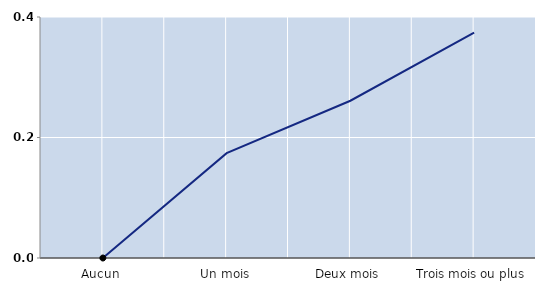
| Category | Nombre de mois passés au chômage l'année précédente |
|---|---|
| Aucun | 0 |
| Un mois | 0.174 |
| Deux mois | 0.261 |
| Trois mois ou plus | 0.374 |